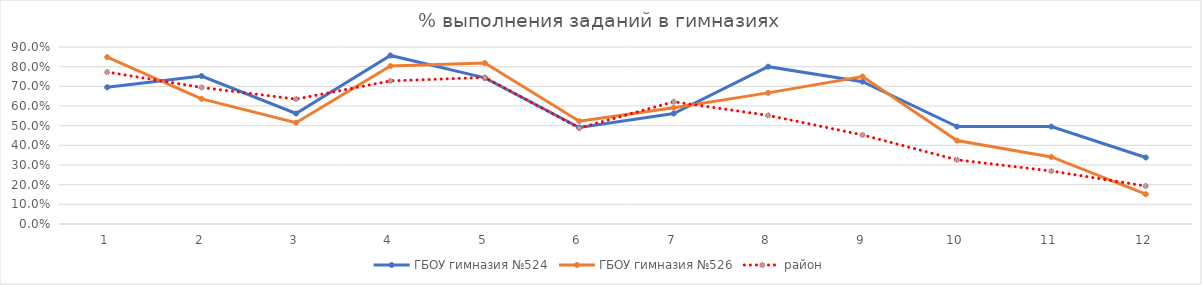
| Category | ГБОУ гимназия №524 | ГБОУ гимназия №526 | район |
|---|---|---|---|
| 0 | 0.695 | 0.848 | 0.773 |
| 1 | 0.752 | 0.636 | 0.694 |
| 2 | 0.562 | 0.515 | 0.635 |
| 3 | 0.857 | 0.803 | 0.728 |
| 4 | 0.743 | 0.818 | 0.745 |
| 5 | 0.49 | 0.523 | 0.488 |
| 6 | 0.562 | 0.591 | 0.622 |
| 7 | 0.8 | 0.667 | 0.552 |
| 8 | 0.724 | 0.75 | 0.453 |
| 9 | 0.495 | 0.424 | 0.326 |
| 10 | 0.495 | 0.341 | 0.269 |
| 11 | 0.338 | 0.152 | 0.193 |